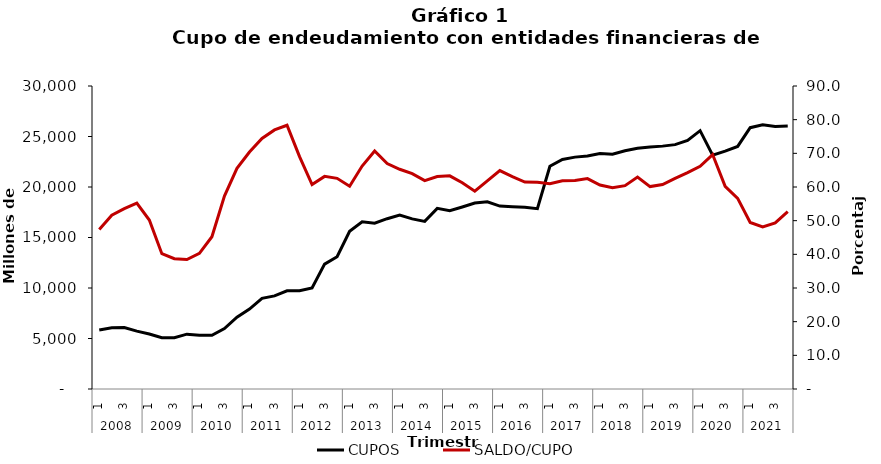
| Category | CUPOS |
|---|---|
| 0 | 5836.823 |
| 1 | 6070.038 |
| 2 | 6076.768 |
| 3 | 5731.561 |
| 4 | 5451.187 |
| 5 | 5070.771 |
| 6 | 5079.931 |
| 7 | 5429.86 |
| 8 | 5332.774 |
| 9 | 5321.073 |
| 10 | 5984.772 |
| 11 | 7106.691 |
| 12 | 7913.098 |
| 13 | 8971.091 |
| 14 | 9218.04 |
| 15 | 9720.196 |
| 16 | 9726.316 |
| 17 | 10011.891 |
| 18 | 12360.789 |
| 19 | 13097.296 |
| 20 | 15611.576 |
| 21 | 16565.522 |
| 22 | 16418.092 |
| 23 | 16860.435 |
| 24 | 17229.695 |
| 25 | 16843.353 |
| 26 | 16594.625 |
| 27 | 17882.124 |
| 28 | 17650.952 |
| 29 | 18020.728 |
| 30 | 18411.995 |
| 31 | 18532.761 |
| 32 | 18111.382 |
| 33 | 18051.765 |
| 34 | 17983.949 |
| 35 | 17852.176 |
| 36 | 22049.86 |
| 37 | 22731.558 |
| 38 | 22958.583 |
| 39 | 23076.501 |
| 40 | 23315.086 |
| 41 | 23247.779 |
| 42 | 23594.844 |
| 43 | 23835.103 |
| 44 | 23970.272 |
| 45 | 24046.872 |
| 46 | 24195.215 |
| 47 | 24608.728 |
| 48 | 25575.819 |
| 49 | 23156.535 |
| 50 | 23546.942 |
| 51 | 24019.874 |
| 52 | 25874.247 |
| 53 | 26158.731 |
| 54 | 25980.899 |
| 55 | 26030.484 |